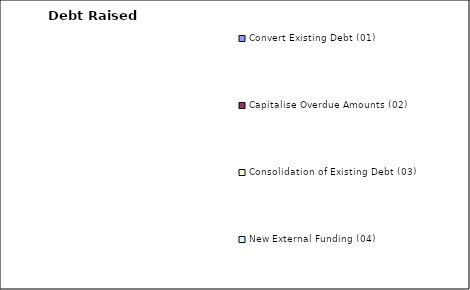
| Category | Debt Raised for |
|---|---|
| Convert Existing Debt (01) | 0 |
| Capitalise Overdue Amounts (02) | 0 |
| Consolidation of Existing Debt (03) | 0 |
| New External Funding (04) | 0 |